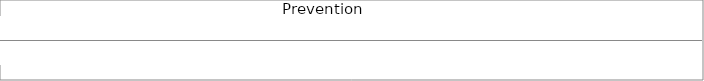
| Category | Series 0 | Series 1 |
|---|---|---|
| 0 | 0 | 0 |
| 1 | 0 | 0 |
| 2 | 0 | 0 |
| 3 | 0 | 0 |
| 4 | 0 | 0 |